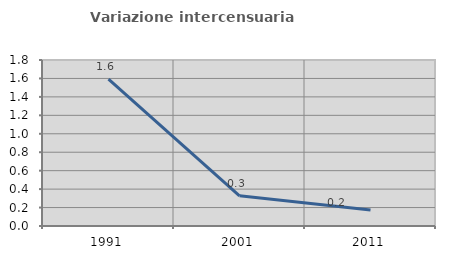
| Category | Variazione intercensuaria annua |
|---|---|
| 1991.0 | 1.592 |
| 2001.0 | 0.327 |
| 2011.0 | 0.174 |